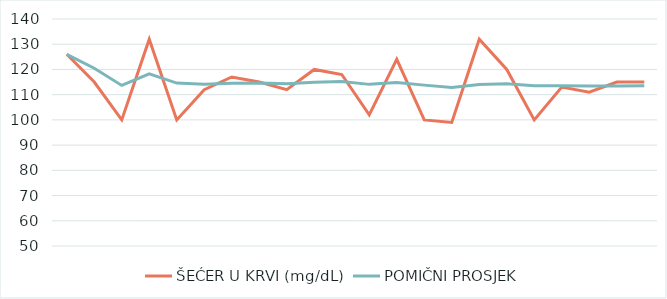
| Category | ŠEĆER U KRVI (mg/dL) | POMIČNI PROSJEK |
|---|---|---|
| 0 | 126 | 126 |
| 1 | 115 | 120.5 |
| 2 | 100 | 113.667 |
| 3 | 132 | 118.25 |
| 4 | 100 | 114.6 |
| 5 | 112 | 114.167 |
| 6 | 117 | 114.571 |
| 7 | 115 | 114.625 |
| 8 | 112 | 114.333 |
| 9 | 120 | 114.9 |
| 10 | 118 | 115.182 |
| 11 | 102 | 114.083 |
| 12 | 124 | 114.846 |
| 13 | 100 | 113.786 |
| 14 | 99 | 112.8 |
| 15 | 132 | 114 |
| 16 | 120 | 114.353 |
| 17 | 100 | 113.556 |
| 18 | 113 | 113.526 |
| 19 | 111 | 113.4 |
| 20 | 115 | 113.476 |
| 21 | 115 | 113.545 |